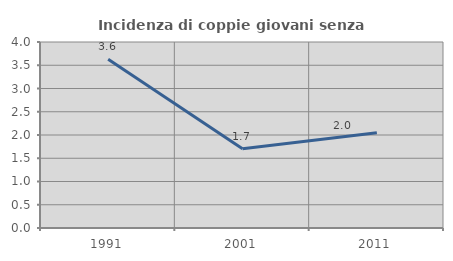
| Category | Incidenza di coppie giovani senza figli |
|---|---|
| 1991.0 | 3.627 |
| 2001.0 | 1.702 |
| 2011.0 | 2.049 |